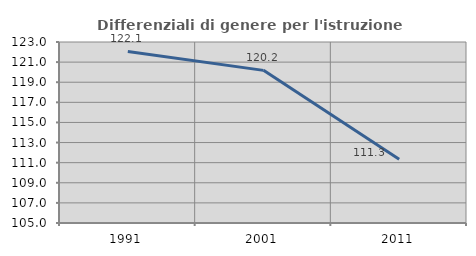
| Category | Differenziali di genere per l'istruzione superiore |
|---|---|
| 1991.0 | 122.06 |
| 2001.0 | 120.18 |
| 2011.0 | 111.334 |